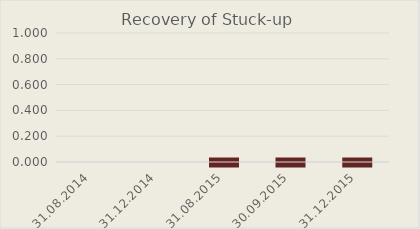
| Category | Recovery of Stuck-up |
|---|---|
| 31.08.2014 | 0 |
| 31.12.2014 | 0 |
| 31.08.2015 | 0 |
| 30.09.2015 | 0 |
| 31.12.2015 | 0 |